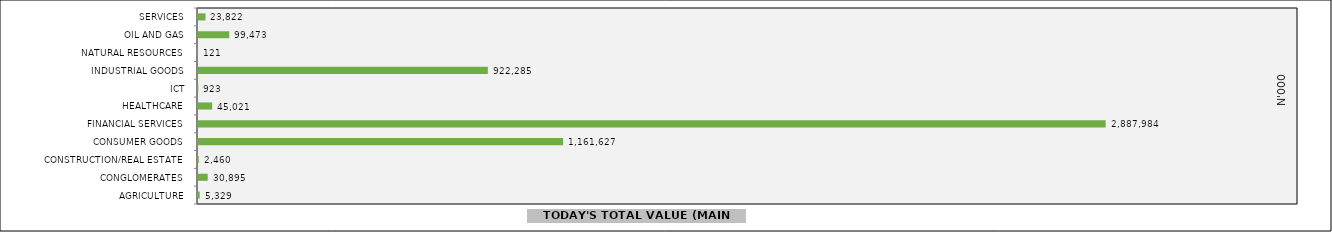
| Category | TODAY'S VALUE |
|---|---|
| AGRICULTURE | 5328589.04 |
| CONGLOMERATES | 30895054.84 |
| CONSTRUCTION/REAL ESTATE | 2459695.68 |
| CONSUMER GOODS | 1161627112.76 |
| FINANCIAL SERVICES | 2887983847.87 |
| HEALTHCARE | 45021437.17 |
| ICT | 923325.26 |
| INDUSTRIAL GOODS | 922284689.81 |
| NATURAL RESOURCES | 120565.5 |
| OIL AND GAS | 99472676.34 |
| SERVICES | 23822088.17 |